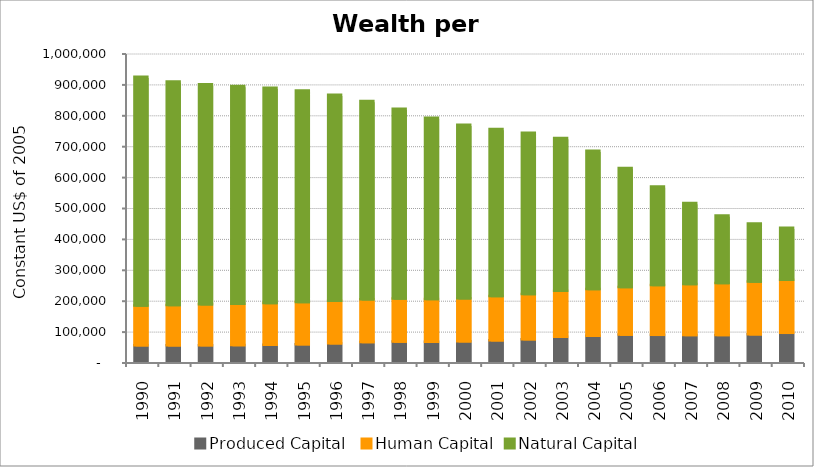
| Category | Produced Capital  | Human Capital | Natural Capital |
|---|---|---|---|
| 1990.0 | 53560.011 | 128269.18 | 740395.296 |
| 1991.0 | 53202.785 | 130450.944 | 723337.262 |
| 1992.0 | 53759.948 | 132055.026 | 712425.226 |
| 1993.0 | 53908.671 | 133640.818 | 704710.416 |
| 1994.0 | 54977.573 | 135104.249 | 696408.903 |
| 1995.0 | 56963.284 | 136462.333 | 684545.377 |
| 1996.0 | 59902.717 | 137521.406 | 666288.014 |
| 1997.0 | 63754.68 | 138303.864 | 641892.237 |
| 1998.0 | 65314.312 | 139712.14 | 613886.005 |
| 1999.0 | 64699.458 | 138090.842 | 586833.206 |
| 2000.0 | 66319.591 | 139233.194 | 561127.896 |
| 2001.0 | 69542.662 | 142900.236 | 540761.81 |
| 2002.0 | 73110.376 | 145813.348 | 522418.764 |
| 2003.0 | 80998.062 | 148757.079 | 494435.407 |
| 2004.0 | 84269.412 | 151240.063 | 447122.554 |
| 2005.0 | 87832.199 | 154263.774 | 385101.213 |
| 2006.0 | 87197.421 | 160939.023 | 319394.083 |
| 2007.0 | 86576.118 | 165245.838 | 262094.432 |
| 2008.0 | 86601.723 | 168355.14 | 218338.209 |
| 2009.0 | 88943.771 | 170462.262 | 188238.648 |
| 2010.0 | 93748.035 | 171788.286 | 168288.375 |